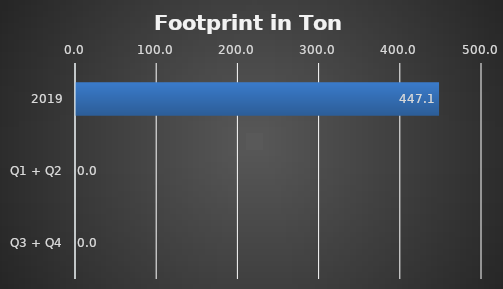
| Category | Series 0 |
|---|---|
| 2019 | 447.1 |
| Q1 + Q2 | 0 |
| Q3 + Q4 | 0 |